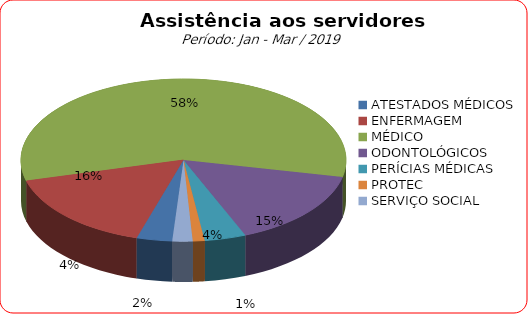
| Category | Series 0 |
|---|---|
| ATESTADOS MÉDICOS | 3.526 |
| ENFERMAGEM | 16.205 |
| MÉDICO | 57.515 |
| ODONTOLÓGICOS | 15.449 |
| PERÍCIAS MÉDICAS | 4.114 |
| PROTEC | 1.175 |
| SERVIÇO SOCIAL | 2.015 |